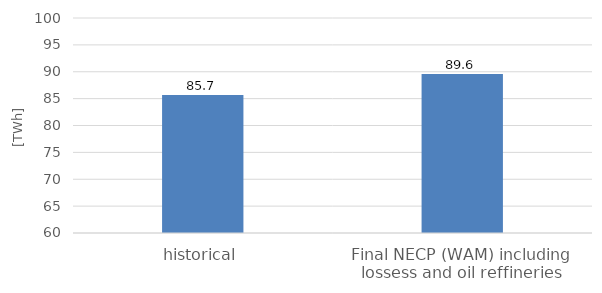
| Category | Series 0 |
|---|---|
| historical | 85.68 |
| Final NECP (WAM) including lossess and oil reffineries | 89.6 |